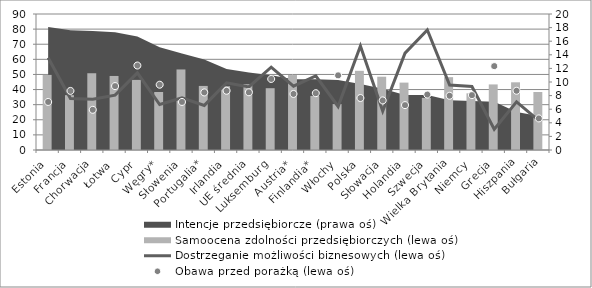
| Category | Samoocena zdolności przedsiębiorczych (lewa oś) |
|---|---|
| Estonia | 49.7 |
| Francja | 36.3 |
| Chorwacja | 50.8 |
| Łotwa | 49 |
| Cypr | 46.4 |
| Węgry* | 38.4 |
| Słowenia | 53.3 |
| Portugalia* | 42.4 |
| Irlandia | 42.2 |
| UE średnia | 43.523 |
| Luksemburg | 40.9 |
| Austria* | 49.6 |
| Finlandia* | 35.8 |
| Włochy | 30.4 |
| Polska | 52.4 |
| Słowacja | 48.5 |
| Holandia | 44.6 |
| Szwecja | 34.5 |
| Wielka Brytania | 48.2 |
| Niemcy | 37.5 |
| Grecja | 43.4 |
| Hiszpania | 44.8 |
| Bułgaria | 38.4 |